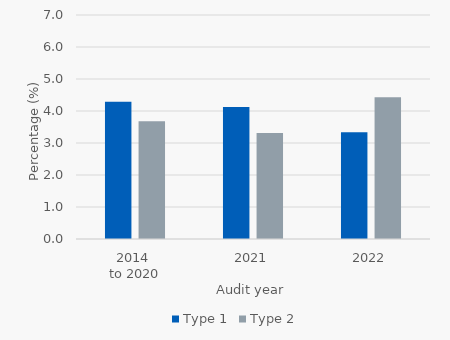
| Category | Type 1 | Type 2 |
|---|---|---|
| 2014 
to 2020 | 4.29 | 3.678 |
| 2021 | 4.128 | 3.314 |
| 2022 | 3.333 | 4.429 |